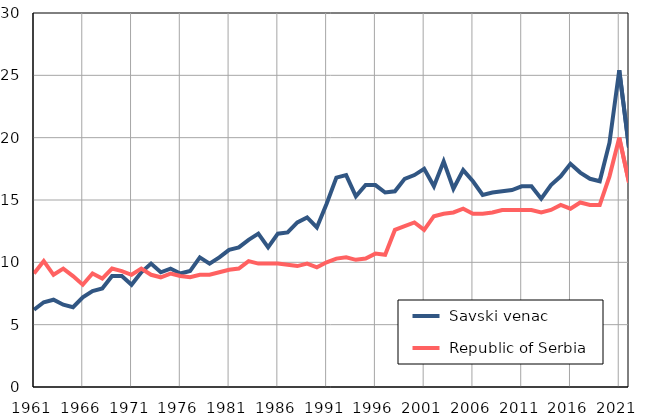
| Category |  Savski venac |  Republic of Serbia |
|---|---|---|
| 1961.0 | 6.2 | 9.1 |
| 1962.0 | 6.8 | 10.1 |
| 1963.0 | 7 | 9 |
| 1964.0 | 6.6 | 9.5 |
| 1965.0 | 6.4 | 8.9 |
| 1966.0 | 7.2 | 8.2 |
| 1967.0 | 7.7 | 9.1 |
| 1968.0 | 7.9 | 8.7 |
| 1969.0 | 8.9 | 9.5 |
| 1970.0 | 8.9 | 9.3 |
| 1971.0 | 8.2 | 9 |
| 1972.0 | 9.2 | 9.5 |
| 1973.0 | 9.9 | 9 |
| 1974.0 | 9.2 | 8.8 |
| 1975.0 | 9.5 | 9.1 |
| 1976.0 | 9.1 | 8.9 |
| 1977.0 | 9.3 | 8.8 |
| 1978.0 | 10.4 | 9 |
| 1979.0 | 9.9 | 9 |
| 1980.0 | 10.4 | 9.2 |
| 1981.0 | 11 | 9.4 |
| 1982.0 | 11.2 | 9.5 |
| 1983.0 | 11.8 | 10.1 |
| 1984.0 | 12.3 | 9.9 |
| 1985.0 | 11.2 | 9.9 |
| 1986.0 | 12.3 | 9.9 |
| 1987.0 | 12.4 | 9.8 |
| 1988.0 | 13.2 | 9.7 |
| 1989.0 | 13.6 | 9.9 |
| 1990.0 | 12.8 | 9.6 |
| 1991.0 | 14.7 | 10 |
| 1992.0 | 16.8 | 10.3 |
| 1993.0 | 17 | 10.4 |
| 1994.0 | 15.3 | 10.2 |
| 1995.0 | 16.2 | 10.3 |
| 1996.0 | 16.2 | 10.7 |
| 1997.0 | 15.6 | 10.6 |
| 1998.0 | 15.7 | 12.6 |
| 1999.0 | 16.7 | 12.9 |
| 2000.0 | 17 | 13.2 |
| 2001.0 | 17.5 | 12.6 |
| 2002.0 | 16.1 | 13.7 |
| 2003.0 | 18.1 | 13.9 |
| 2004.0 | 15.9 | 14 |
| 2005.0 | 17.4 | 14.3 |
| 2006.0 | 16.5 | 13.9 |
| 2007.0 | 15.4 | 13.9 |
| 2008.0 | 15.6 | 14 |
| 2009.0 | 15.7 | 14.2 |
| 2010.0 | 15.8 | 14.2 |
| 2011.0 | 16.1 | 14.2 |
| 2012.0 | 16.1 | 14.2 |
| 2013.0 | 15.1 | 14 |
| 2014.0 | 16.2 | 14.2 |
| 2015.0 | 16.9 | 14.6 |
| 2016.0 | 17.9 | 14.3 |
| 2017.0 | 17.2 | 14.8 |
| 2018.0 | 16.7 | 14.6 |
| 2019.0 | 16.5 | 14.6 |
| 2020.0 | 19.6 | 16.9 |
| 2021.0 | 25.4 | 20 |
| 2022.0 | 19.2 | 16.4 |